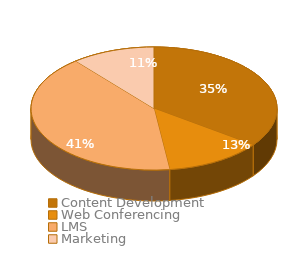
| Category | $46,375.00  |
|---|---|
| Content Development | 16270 |
| Web Conferencing | 5976 |
| LMS | 19048 |
| Marketing | 5081 |